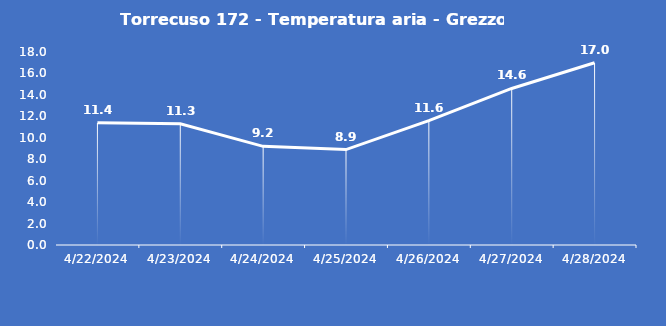
| Category | Torrecuso 172 - Temperatura aria - Grezzo (°C) |
|---|---|
| 4/22/24 | 11.4 |
| 4/23/24 | 11.3 |
| 4/24/24 | 9.2 |
| 4/25/24 | 8.9 |
| 4/26/24 | 11.6 |
| 4/27/24 | 14.6 |
| 4/28/24 | 17 |